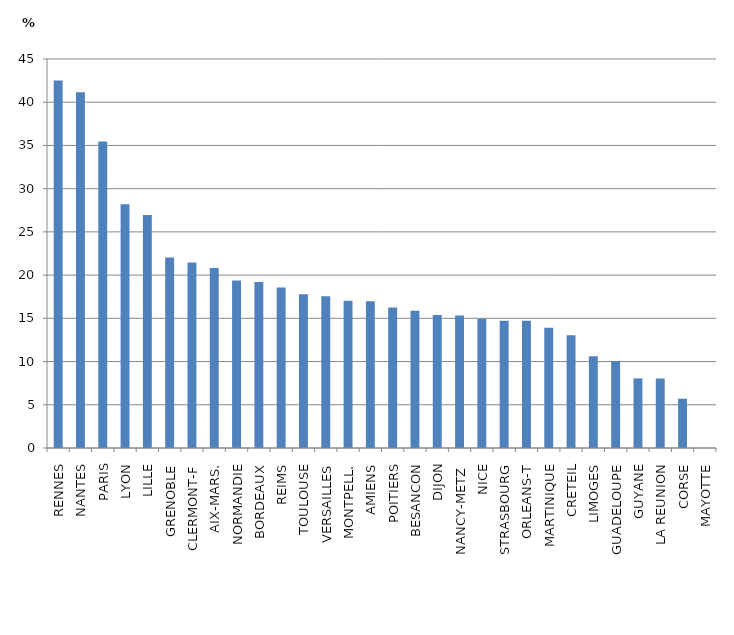
| Category | Part du secteur privé sous contrat dans le second degré |
|---|---|
| RENNES | 42.517 |
| NANTES | 41.155 |
| PARIS | 35.454 |
| LYON | 28.199 |
| LILLE | 26.945 |
| GRENOBLE | 22.051 |
| CLERMONT-F | 21.473 |
| AIX-MARS. | 20.824 |
| NORMANDIE | 19.371 |
| BORDEAUX | 19.192 |
| REIMS | 18.558 |
| TOULOUSE | 17.793 |
| VERSAILLES | 17.541 |
| MONTPELL. | 17.045 |
| AMIENS | 16.99 |
| POITIERS | 16.252 |
| BESANCON | 15.889 |
| DIJON | 15.394 |
| NANCY-METZ  | 15.326 |
| NICE | 14.949 |
| STRASBOURG | 14.728 |
| ORLEANS-T | 14.726 |
| MARTINIQUE | 13.899 |
| CRETEIL | 13.05 |
| LIMOGES | 10.626 |
| GUADELOUPE | 10.068 |
| GUYANE | 8.05 |
| LA REUNION | 8.039 |
| CORSE | 5.704 |
| MAYOTTE | 0 |